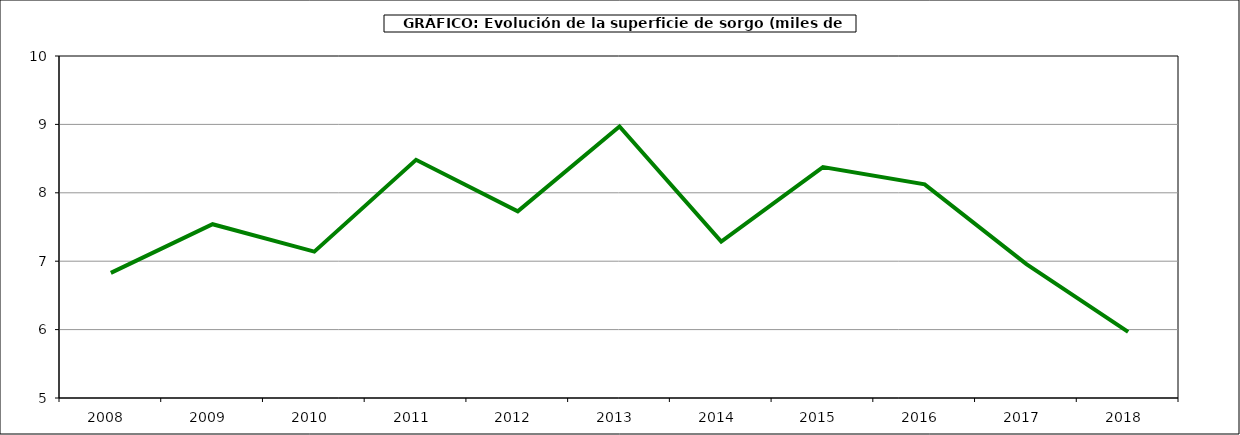
| Category | Superficie |
|---|---|
| 2008.0 | 6.829 |
| 2009.0 | 7.541 |
| 2010.0 | 7.14 |
| 2011.0 | 8.482 |
| 2012.0 | 7.729 |
| 2013.0 | 8.97 |
| 2014.0 | 7.288 |
| 2015.0 | 8.375 |
| 2016.0 | 8.124 |
| 2017.0 | 6.958 |
| 2018.0 | 5.967 |